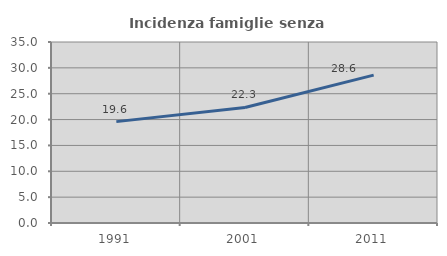
| Category | Incidenza famiglie senza nuclei |
|---|---|
| 1991.0 | 19.602 |
| 2001.0 | 22.347 |
| 2011.0 | 28.596 |